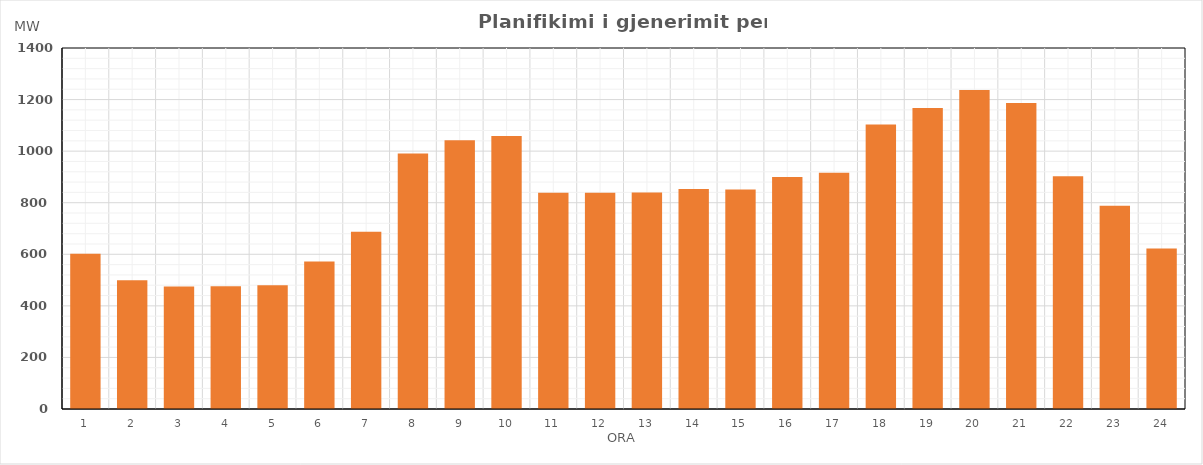
| Category | Max (MW) |
|---|---|
| 0 | 602.27 |
| 1 | 499.45 |
| 2 | 474.98 |
| 3 | 476.09 |
| 4 | 480.06 |
| 5 | 572.47 |
| 6 | 687.4 |
| 7 | 991.12 |
| 8 | 1042.03 |
| 9 | 1058.4 |
| 10 | 838.61 |
| 11 | 838.21 |
| 12 | 839.71 |
| 13 | 852.74 |
| 14 | 851.64 |
| 15 | 899.3 |
| 16 | 916.08 |
| 17 | 1103.35 |
| 18 | 1167.24 |
| 19 | 1237.29 |
| 20 | 1186.29 |
| 21 | 902.66 |
| 22 | 788.64 |
| 23 | 622 |